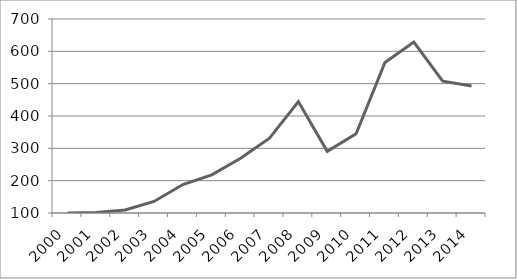
| Category | Białoruś |
|---|---|
| 2000.0 | 100 |
| 2001.0 | 101.701 |
| 2002.0 | 109.479 |
| 2003.0 | 135.75 |
| 2004.0 | 188.001 |
| 2005.0 | 218.102 |
| 2006.0 | 269.355 |
| 2007.0 | 331.34 |
| 2008.0 | 444.568 |
| 2009.0 | 290.787 |
| 2010.0 | 345.101 |
| 2011.0 | 565.335 |
| 2012.0 | 628.684 |
| 2013.0 | 507.795 |
| 2014.0 | 492.472 |